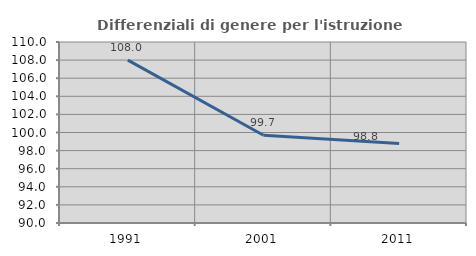
| Category | Differenziali di genere per l'istruzione superiore |
|---|---|
| 1991.0 | 108.001 |
| 2001.0 | 99.692 |
| 2011.0 | 98.784 |